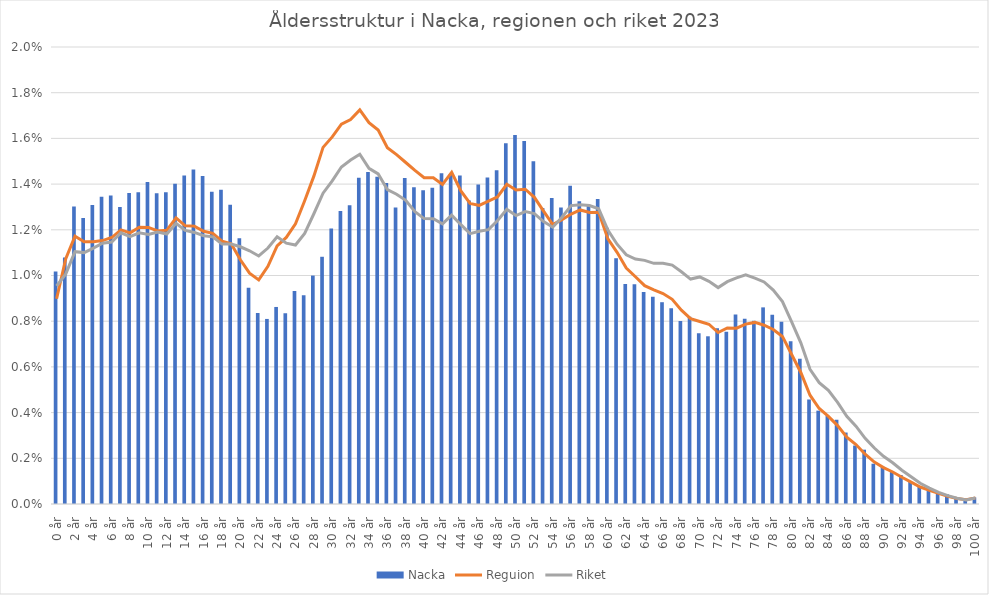
| Category | Nacka |
|---|---|
| 0 år | 0.01 |
| 1 år | 0.011 |
| 2 år | 0.013 |
| 3 år | 0.013 |
| 4 år | 0.013 |
| 5 år | 0.013 |
| 6 år | 0.014 |
| 7 år | 0.013 |
| 8 år | 0.014 |
| 9 år | 0.014 |
| 10 år | 0.014 |
| 11 år | 0.014 |
| 12 år | 0.014 |
| 13 år | 0.014 |
| 14 år | 0.014 |
| 15 år | 0.015 |
| 16 år | 0.014 |
| 17 år | 0.014 |
| 18 år | 0.014 |
| 19 år | 0.013 |
| 20 år | 0.012 |
| 21 år | 0.009 |
| 22 år | 0.008 |
| 23 år | 0.008 |
| 24 år | 0.009 |
| 25 år | 0.008 |
| 26 år | 0.009 |
| 27 år | 0.009 |
| 28 år | 0.01 |
| 29 år | 0.011 |
| 30 år | 0.012 |
| 31 år | 0.013 |
| 32 år | 0.013 |
| 33 år | 0.014 |
| 34 år | 0.015 |
| 35 år | 0.014 |
| 36 år | 0.014 |
| 37 år | 0.013 |
| 38 år | 0.014 |
| 39 år | 0.014 |
| 40 år | 0.014 |
| 41 år | 0.014 |
| 42 år | 0.014 |
| 43 år | 0.014 |
| 44 år | 0.014 |
| 45 år | 0.013 |
| 46 år | 0.014 |
| 47 år | 0.014 |
| 48 år | 0.015 |
| 49 år | 0.016 |
| 50 år | 0.016 |
| 51 år | 0.016 |
| 52 år | 0.015 |
| 53 år | 0.013 |
| 54 år | 0.013 |
| 55 år | 0.013 |
| 56 år | 0.014 |
| 57 år | 0.013 |
| 58 år | 0.013 |
| 59 år | 0.013 |
| 60 år | 0.012 |
| 61 år | 0.011 |
| 62 år | 0.01 |
| 63 år | 0.01 |
| 64 år | 0.009 |
| 65 år | 0.009 |
| 66 år | 0.009 |
| 67 år | 0.009 |
| 68 år | 0.008 |
| 69 år | 0.008 |
| 70 år | 0.007 |
| 71 år | 0.007 |
| 72 år | 0.008 |
| 73 år | 0.008 |
| 74 år | 0.008 |
| 75 år | 0.008 |
| 76 år | 0.008 |
| 77 år | 0.009 |
| 78 år | 0.008 |
| 79 år | 0.008 |
| 80 år | 0.007 |
| 81 år | 0.006 |
| 82 år | 0.005 |
| 83 år | 0.004 |
| 84 år | 0.004 |
| 85 år | 0.004 |
| 86 år | 0.003 |
| 87 år | 0.003 |
| 88 år | 0.002 |
| 89 år | 0.002 |
| 90 år | 0.002 |
| 91 år | 0.001 |
| 92 år | 0.001 |
| 93 år | 0.001 |
| 94 år | 0.001 |
| 95 år | 0.001 |
| 96 år | 0 |
| 97 år | 0 |
| 98 år | 0 |
| 99 år | 0 |
| 100 år | 0 |